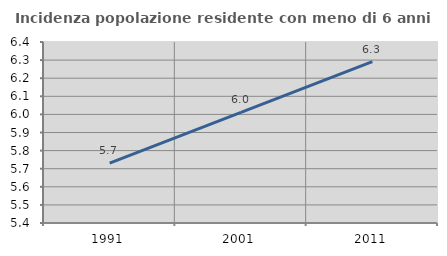
| Category | Incidenza popolazione residente con meno di 6 anni |
|---|---|
| 1991.0 | 5.731 |
| 2001.0 | 6.012 |
| 2011.0 | 6.291 |